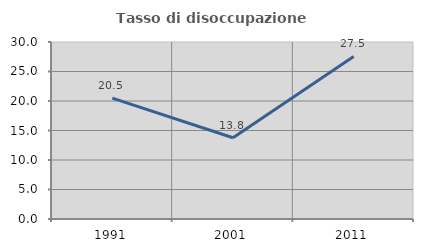
| Category | Tasso di disoccupazione giovanile  |
|---|---|
| 1991.0 | 20.489 |
| 2001.0 | 13.772 |
| 2011.0 | 27.547 |